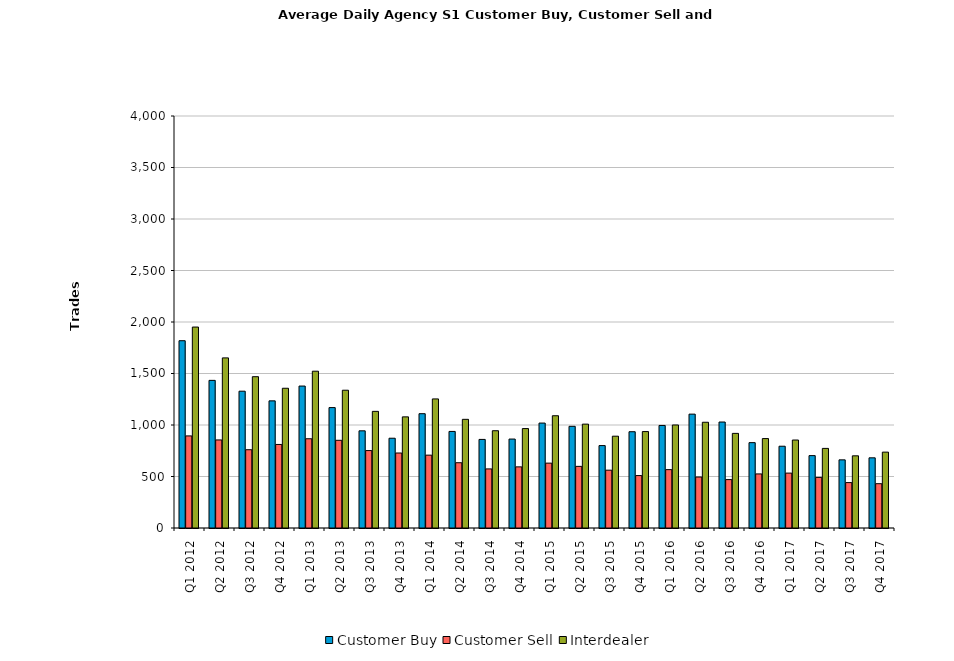
| Category | Customer Buy | Customer Sell | Interdealer |
|---|---|---|---|
| Q1 2012 | 1818.403 | 893.984 | 1950.984 |
| Q2 2012 | 1433.317 | 854.921 | 1651.683 |
| Q3 2012 | 1328.175 | 759.905 | 1468.937 |
| Q4 2012 | 1234.317 | 811.079 | 1356.746 |
| Q1 2013 | 1378.153 | 866.39 | 1522.169 |
| Q2 2013 | 1169.125 | 851.344 | 1337.641 |
| Q3 2013 | 943.422 | 751.781 | 1132.391 |
| Q4 2013 | 871.625 | 728.125 | 1079 |
| Q1 2014 | 1109.705 | 707.328 | 1253.279 |
| Q2 2014 | 937.619 | 633.714 | 1054.984 |
| Q3 2014 | 860.031 | 573.609 | 944.453 |
| Q4 2014 | 863.531 | 593.469 | 965.375 |
| Q1 2015 | 1018.672 | 629.803 | 1089.902 |
| Q2 2015 | 987.222 | 598.317 | 1008.46 |
| Q3 2015 | 800.078 | 561.359 | 891.312 |
| Q4 2015 | 934.656 | 509 | 936.266 |
| Q1 2016 | 995.656 | 566.607 | 1000.246 |
| Q2 2016 | 1105.578 | 494.969 | 1026.594 |
| Q3 2016 | 1028.922 | 469.828 | 918.625 |
| Q4 2016 | 828.651 | 525.016 | 868.317 |
| Q1 2017 | 793.887 | 533.016 | 854.177 |
| Q2 2017 | 702.762 | 491.206 | 772.857 |
| Q3 2017 | 661.651 | 440.937 | 700.746 |
| Q4 2017 | 681.365 | 430.111 | 736.524 |